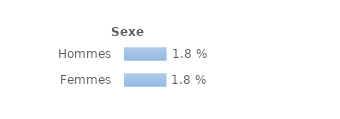
| Category | Series 0 |
|---|---|
| Hommes | 0.018 |
| Femmes | 0.018 |